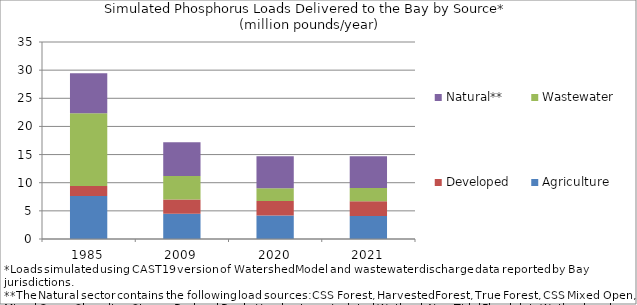
| Category | Agriculture | Developed | Wastewater | Natural** |
|---|---|---|---|---|
| 1985.0 | 7.638 | 1.791 | 12.931 | 7.07 |
| 2009.0 | 4.467 | 2.542 | 4.189 | 5.973 |
| 2020.0 | 4.16 | 2.608 | 2.259 | 5.686 |
| 2021.0 | 4.076 | 2.648 | 2.317 | 5.667 |